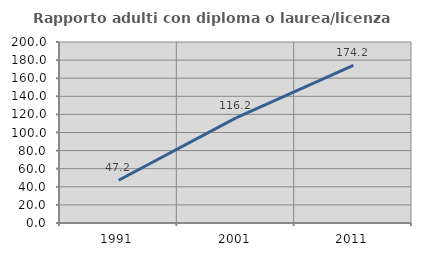
| Category | Rapporto adulti con diploma o laurea/licenza media  |
|---|---|
| 1991.0 | 47.222 |
| 2001.0 | 116.216 |
| 2011.0 | 174.194 |